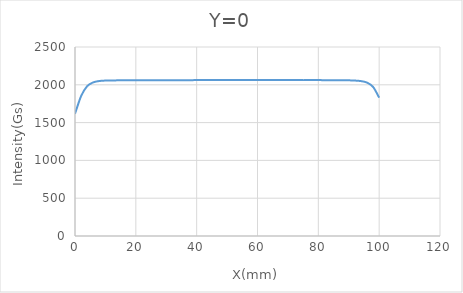
| Category | Y=0 |
|---|---|
| 0.0 | 1616 |
| 2.0 | 1850 |
| 4.0 | 1982 |
| 6.0 | 2032 |
| 8.0 | 2050 |
| 10.0 | 2056 |
| 15.0 | 2059 |
| 20.0 | 2059 |
| 25.0 | 2060 |
| 30.0 | 2060 |
| 35.0 | 2061 |
| 40.0 | 2062 |
| 45.0 | 2062 |
| 50.0 | 2062 |
| 55.0 | 2063 |
| 60.0 | 2063 |
| 65.0 | 2063 |
| 70.0 | 2063 |
| 75.0 | 2062 |
| 80.0 | 2062 |
| 85.0 | 2061 |
| 90.0 | 2059 |
| 92.0 | 2056 |
| 94.0 | 2049 |
| 96.0 | 2029 |
| 98.0 | 1972 |
| 100.0 | 1830 |